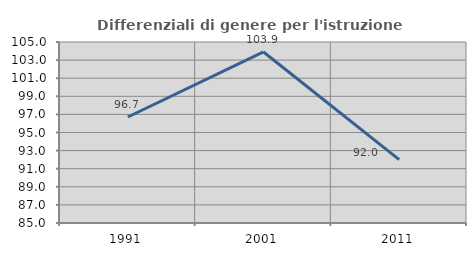
| Category | Differenziali di genere per l'istruzione superiore |
|---|---|
| 1991.0 | 96.712 |
| 2001.0 | 103.899 |
| 2011.0 | 92.002 |